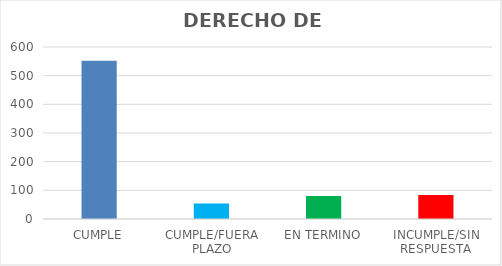
| Category | TOTAL |
|---|---|
| CUMPLE | 552 |
| CUMPLE/FUERA PLAZO | 54 |
| EN TERMINO | 80 |
| INCUMPLE/SIN RESPUESTA | 84 |